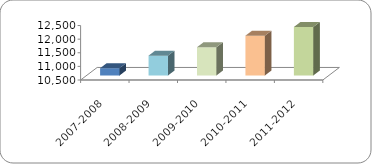
| Category | COSTO POR ALUMNO |
|---|---|
| 2007-2008 | 10769.373 |
| 2008-2009 | 11229 |
| 2009-2010 | 11539.434 |
| 2010-2011 | 11961.876 |
| 2011-2012 | 12282.597 |